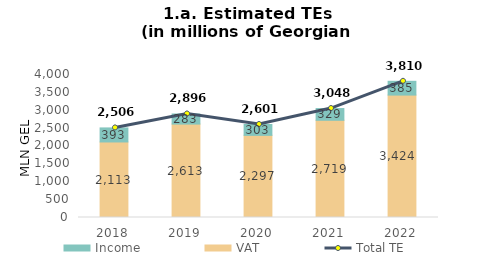
| Category | VAT | Income |
|---|---|---|
| 2018.0 | 2112.727 | 393.098 |
| 2019.0 | 2612.826 | 282.786 |
| 2020.0 | 2297.207 | 303.441 |
| 2021.0 | 2719.125 | 328.629 |
| 2022.0 | 3424.268 | 385.314 |